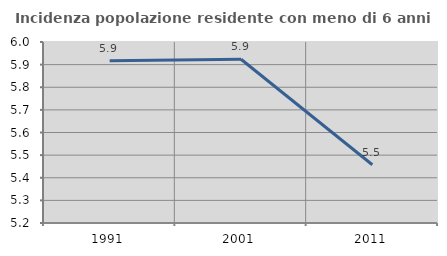
| Category | Incidenza popolazione residente con meno di 6 anni |
|---|---|
| 1991.0 | 5.917 |
| 2001.0 | 5.924 |
| 2011.0 | 5.457 |